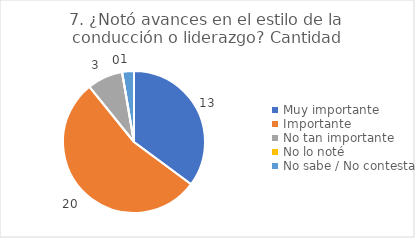
| Category | 7. ¿Notó avances en el estilo de la conducción o liderazgo? |
|---|---|
| Muy importante  | 0.351 |
| Importante  | 0.541 |
| No tan importante  | 0.081 |
| No lo noté  | 0 |
| No sabe / No contesta | 0.027 |